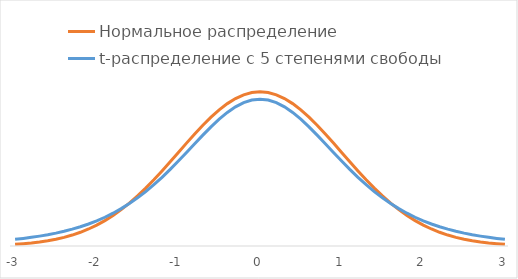
| Category | Нормальное распределение | t-распределение с 5 степенями свободы |
|---|---|---|
| -3.0 | 0.004 | 0.017 |
| -2.9 | 0.006 | 0.02 |
| -2.8 | 0.008 | 0.022 |
| -2.6999999999999997 | 0.01 | 0.026 |
| -2.5999999999999996 | 0.014 | 0.029 |
| -2.4999999999999996 | 0.018 | 0.033 |
| -2.3999999999999995 | 0.022 | 0.038 |
| -2.2999999999999994 | 0.028 | 0.044 |
| -2.1999999999999993 | 0.035 | 0.05 |
| -2.099999999999999 | 0.044 | 0.057 |
| -1.9999999999999991 | 0.054 | 0.065 |
| -1.899999999999999 | 0.066 | 0.074 |
| -1.799999999999999 | 0.079 | 0.085 |
| -1.6999999999999988 | 0.094 | 0.097 |
| -1.5999999999999988 | 0.111 | 0.11 |
| -1.4999999999999987 | 0.13 | 0.125 |
| -1.3999999999999986 | 0.15 | 0.141 |
| -1.2999999999999985 | 0.171 | 0.158 |
| -1.1999999999999984 | 0.194 | 0.178 |
| -1.0999999999999983 | 0.218 | 0.198 |
| -0.9999999999999983 | 0.242 | 0.22 |
| -0.8999999999999984 | 0.266 | 0.242 |
| -0.7999999999999984 | 0.29 | 0.264 |
| -0.6999999999999984 | 0.312 | 0.287 |
| -0.5999999999999984 | 0.333 | 0.308 |
| -0.49999999999999845 | 0.352 | 0.328 |
| -0.39999999999999847 | 0.368 | 0.345 |
| -0.2999999999999985 | 0.381 | 0.36 |
| -0.19999999999999848 | 0.391 | 0.371 |
| -0.09999999999999848 | 0.397 | 0.377 |
| 0.0 | 0.399 | 0.38 |
| 0.1 | 0.397 | 0.377 |
| 0.2 | 0.391 | 0.371 |
| 0.30000000000000004 | 0.381 | 0.36 |
| 0.4 | 0.368 | 0.345 |
| 0.5 | 0.352 | 0.328 |
| 0.6 | 0.333 | 0.308 |
| 0.7 | 0.312 | 0.287 |
| 0.7999999999999999 | 0.29 | 0.264 |
| 0.8999999999999999 | 0.266 | 0.242 |
| 0.9999999999999999 | 0.242 | 0.22 |
| 1.0999999999999999 | 0.218 | 0.198 |
| 1.2 | 0.194 | 0.178 |
| 1.3 | 0.171 | 0.158 |
| 1.4000000000000001 | 0.15 | 0.141 |
| 1.5000000000000002 | 0.13 | 0.125 |
| 1.6000000000000003 | 0.111 | 0.11 |
| 1.7000000000000004 | 0.094 | 0.097 |
| 1.8000000000000005 | 0.079 | 0.085 |
| 1.9000000000000006 | 0.066 | 0.074 |
| 2.0000000000000004 | 0.054 | 0.065 |
| 2.1000000000000005 | 0.044 | 0.057 |
| 2.2000000000000006 | 0.035 | 0.05 |
| 2.3000000000000007 | 0.028 | 0.044 |
| 2.400000000000001 | 0.022 | 0.038 |
| 2.500000000000001 | 0.018 | 0.033 |
| 2.600000000000001 | 0.014 | 0.029 |
| 2.700000000000001 | 0.01 | 0.026 |
| 2.800000000000001 | 0.008 | 0.022 |
| 2.9000000000000012 | 0.006 | 0.02 |
| 3.0000000000000013 | 0.004 | 0.017 |